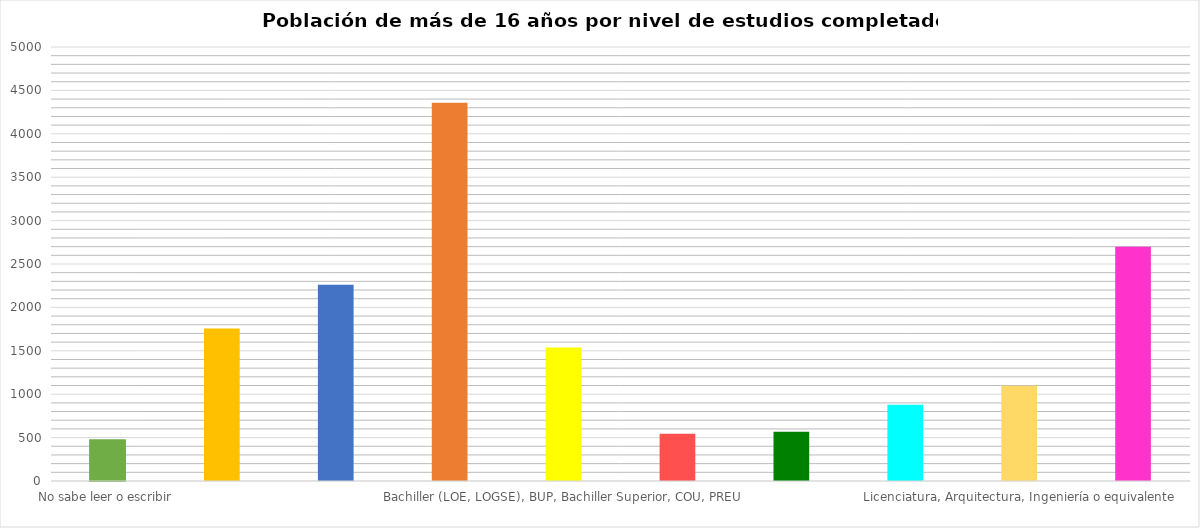
| Category | Series 0 |
|---|---|
| No sabe leer o escribir | 468.099 |
| Sabe leer y escribir pero fue menos de 5 años a la escuela | 1757.684 |
| Fue a la escuela 5 o más años pero no llegó al último curso de ESO, EGB o Bachiller Elemental | 2260.002 |
| Llegó al último curso de ESO, EGB o Bachiller Elemental o tiene el Certificado de Escolaridad o de Estudios Primarios | 4358.77 |
| Bachiller (LOE, LOGSE), BUP, Bachiller Superior, COU, PREU | 1539.287 |
| FP grado medio, FP I, Oficialía industrial o equivalente, Grado Medio de Música y Danza, Certificados de Escuelas Oficiales de Idiomas | 543.105 |
| FP grado superior, FP II, Maestría industrial o equivalente | 567.659 |
| Diplomatura universitaria, Arquitectura Técnica, Ingeniería Técnica o equivalente | 879.551 |
| Licenciatura, Arquitectura, Ingeniería o equivalente | 1096.866 |
| No procede | 2699.389 |